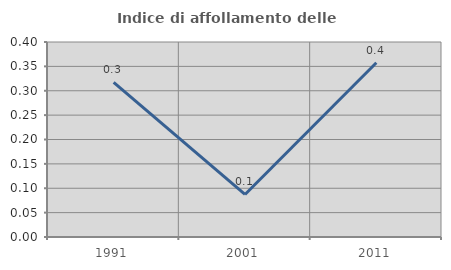
| Category | Indice di affollamento delle abitazioni  |
|---|---|
| 1991.0 | 0.317 |
| 2001.0 | 0.087 |
| 2011.0 | 0.358 |